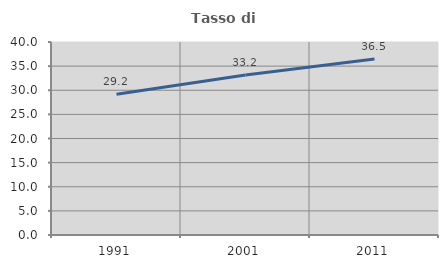
| Category | Tasso di occupazione   |
|---|---|
| 1991.0 | 29.171 |
| 2001.0 | 33.178 |
| 2011.0 | 36.485 |